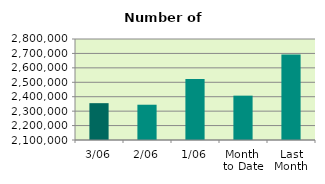
| Category | Series 0 |
|---|---|
| 3/06 | 2355280 |
| 2/06 | 2344472 |
| 1/06 | 2522324 |
| Month 
to Date | 2407358.667 |
| Last
Month | 2692139.333 |